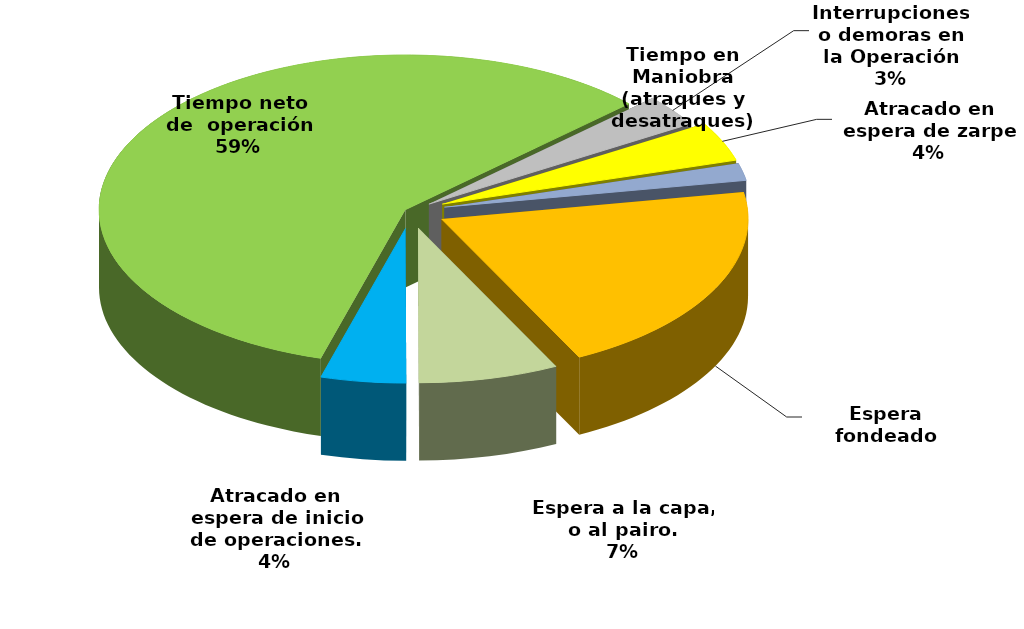
| Category | Series 0 |
|---|---|
| Espera fondeado | 35395.183 |
| Espera a la capa, o al pairo. | 12828.65 |
| Atracado en espera de inicio de operaciones. | 7794.109 |
| Tiempo neto de  operación | 101742.12 |
| Interrupciones o demoras en la Operación | 5742.45 |
| Atracado en espera de zarpe | 7148.098 |
| Tiempo en Maniobra (atraques y desatraques) | 3154.033 |